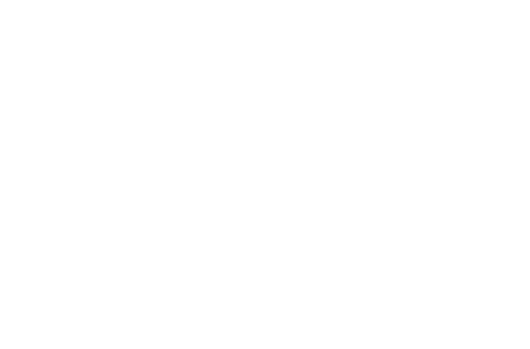
| Category | Главница платена | Платена лихва |
|---|---|---|
| 2019 | 316.351 | 226.28 |
| 2020 | 1105.769 | 739.178 |
| 2021 | 1939.715 | 1207.547 |
| 2022 | 2820.703 | 1628.874 |
| 2023 | 3751.386 | 2000.507 |
| 2024 | 4734.566 | 2319.642 |
| 2025 | 5773.206 | 2583.318 |
| 2026 | 6870.433 | 2788.406 |
| 2027 | 8029.552 | 2931.602 |
| 2028 | 9254.054 | 3009.415 |
| 2029 | 10000 | 3023.153 |